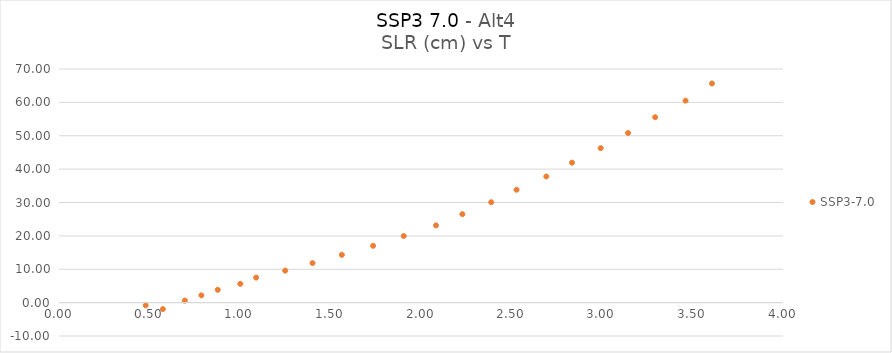
| Category | SSP3-7.0 |
|---|---|
| 0.573801925 | -1.941 |
| 0.479031654 | -0.818 |
| 0.695197934 | 0.621 |
| 0.786748548 | 2.18 |
| 0.877021499 | 3.834 |
| 1.001520332 | 5.633 |
| 1.089128948 | 7.505 |
| 1.249789297 | 9.582 |
| 1.40067604 | 11.846 |
| 1.562619809 | 14.32 |
| 1.735359054 | 17.026 |
| 1.904626317 | 19.96 |
| 2.082906789 | 23.142 |
| 2.228533462 | 26.507 |
| 2.38808496 | 30.082 |
| 2.527901417 | 33.827 |
| 2.692389326 | 37.794 |
| 2.834347575 | 41.934 |
| 2.992719926 | 46.284 |
| 3.14393675 | 50.826 |
| 3.293695187 | 55.559 |
| 3.46161926 | 60.522 |
| 3.607543507 | 65.666 |